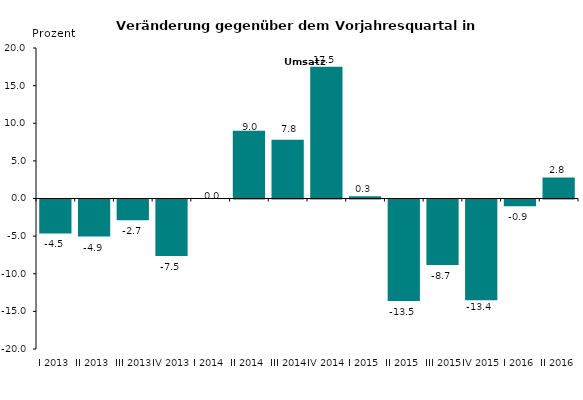
| Category | Series 0 |
|---|---|
| I 2013 | -4.513 |
| II 2013 | -4.922 |
| III 2013 | -2.749 |
| IV 2013 | -7.5 |
| I 2014 | 0 |
| II 2014 | 9 |
| III 2014 | 7.8 |
| IV 2014 | 17.5 |
| I 2015 | 0.3 |
| II 2015 | -13.5 |
| III 2015 | -8.7 |
| IV 2015 | -13.4 |
| I 2016 | -0.9 |
| II 2016 | 2.8 |